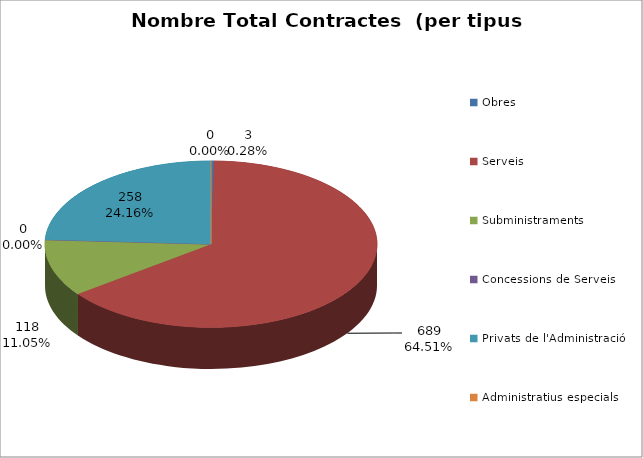
| Category | Nombre Total Contractes |
|---|---|
| Obres | 3 |
| Serveis | 689 |
| Subministraments | 118 |
| Concessions de Serveis | 0 |
| Privats de l'Administració | 258 |
| Administratius especials | 0 |